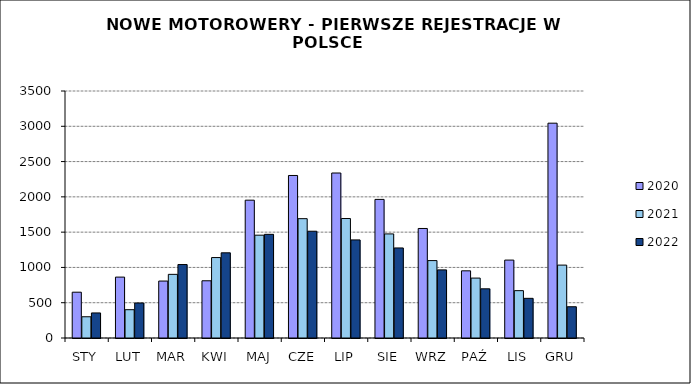
| Category | 2020 | 2021 | 2022 |
|---|---|---|---|
|  STY  | 649 | 301 | 355 |
|  LUT  | 863 | 401 | 496 |
| MAR | 807 | 902 | 1041 |
| KWI | 811 | 1140 | 1207 |
| MAJ | 1953 | 1457 | 1469 |
| CZE | 2303 | 1691 | 1513 |
| LIP | 2338 | 1693 | 1390 |
| SIE | 1964 | 1475 | 1276 |
| WRZ | 1552 | 1097 | 965 |
| PAŹ | 952 | 849 | 697 |
| LIS | 1104 | 671 | 562 |
| GRU | 3044 | 1033 | 443 |